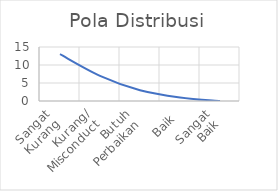
| Category | Pola Distribusi |
|---|---|
| Sangat
Kurang | 13 |
| Kurang/
Misconduct | 7 |
| Butuh
Perbaikan | 3 |
| Baik | 1 |
| Sangat
Baik | 0 |